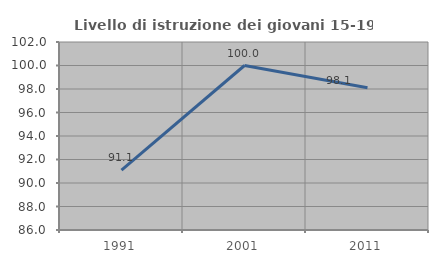
| Category | Livello di istruzione dei giovani 15-19 anni |
|---|---|
| 1991.0 | 91.089 |
| 2001.0 | 100 |
| 2011.0 | 98.113 |